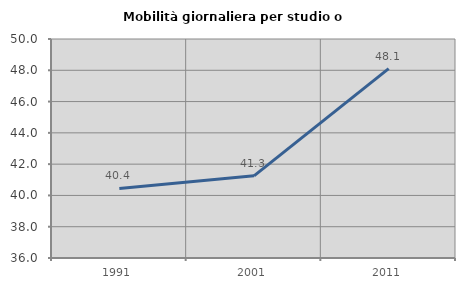
| Category | Mobilità giornaliera per studio o lavoro |
|---|---|
| 1991.0 | 40.446 |
| 2001.0 | 41.253 |
| 2011.0 | 48.107 |